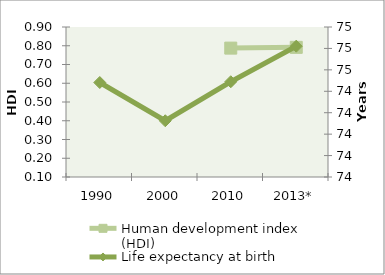
| Category | Human development index (HDI) |
|---|---|
| 1990 | 0 |
| 2000 | 0 |
| 2010 | 0.787 |
| 2013* | 0.791 |